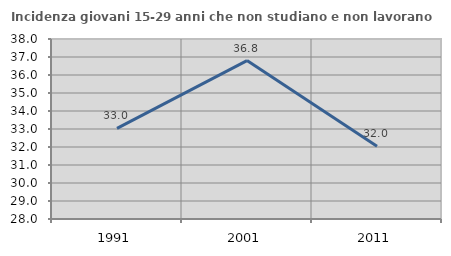
| Category | Incidenza giovani 15-29 anni che non studiano e non lavorano  |
|---|---|
| 1991.0 | 33.039 |
| 2001.0 | 36.8 |
| 2011.0 | 32.044 |